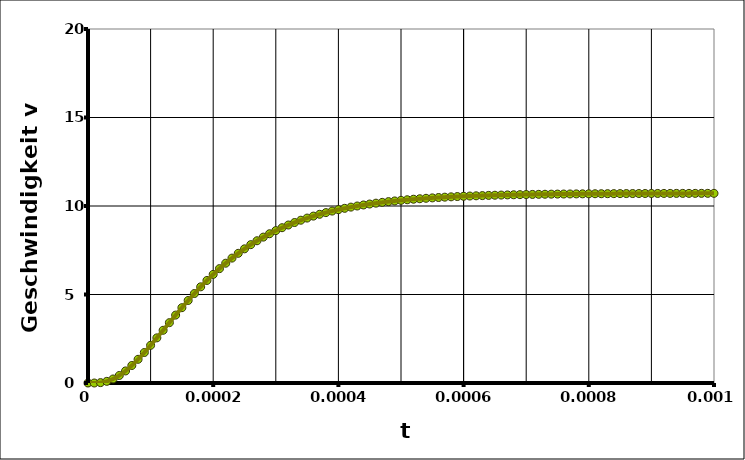
| Category | Series 0 |
|---|---|
| 0.0 | 0 |
| 1e-05 | 0 |
| 2e-05 | 0.022 |
| 3.0000000000000004e-05 | 0.093 |
| 4e-05 | 0.227 |
| 5e-05 | 0.424 |
| 6e-05 | 0.681 |
| 7.000000000000001e-05 | 0.989 |
| 8e-05 | 1.339 |
| 9e-05 | 1.722 |
| 0.0001 | 2.128 |
| 0.00011 | 2.55 |
| 0.00012 | 2.979 |
| 0.00013000000000000002 | 3.409 |
| 0.00014000000000000001 | 3.836 |
| 0.00015000000000000001 | 4.255 |
| 0.00016 | 4.662 |
| 0.00017 | 5.055 |
| 0.00018 | 5.433 |
| 0.00019 | 5.794 |
| 0.0002 | 6.137 |
| 0.00021 | 6.461 |
| 0.00022 | 6.768 |
| 0.00023 | 7.056 |
| 0.00024 | 7.326 |
| 0.00025 | 7.58 |
| 0.00026000000000000003 | 7.816 |
| 0.00027000000000000006 | 8.036 |
| 0.0002800000000000001 | 8.242 |
| 0.0002900000000000001 | 8.432 |
| 0.00030000000000000014 | 8.61 |
| 0.00031000000000000016 | 8.774 |
| 0.0003200000000000002 | 8.926 |
| 0.0003300000000000002 | 9.067 |
| 0.00034000000000000024 | 9.197 |
| 0.00035000000000000027 | 9.318 |
| 0.0003600000000000003 | 9.429 |
| 0.0003700000000000003 | 9.532 |
| 0.00038000000000000035 | 9.626 |
| 0.00039000000000000037 | 9.714 |
| 0.0004000000000000004 | 9.794 |
| 0.0004100000000000004 | 9.869 |
| 0.00042000000000000045 | 9.937 |
| 0.0004300000000000005 | 10 |
| 0.0004400000000000005 | 10.058 |
| 0.00045000000000000053 | 10.111 |
| 0.00046000000000000056 | 10.161 |
| 0.0004700000000000006 | 10.206 |
| 0.0004800000000000006 | 10.247 |
| 0.0004900000000000006 | 10.286 |
| 0.0005000000000000007 | 10.321 |
| 0.0005100000000000007 | 10.353 |
| 0.0005200000000000007 | 10.383 |
| 0.0005300000000000007 | 10.41 |
| 0.0005400000000000008 | 10.436 |
| 0.0005500000000000008 | 10.459 |
| 0.0005600000000000008 | 10.48 |
| 0.0005700000000000008 | 10.5 |
| 0.0005800000000000009 | 10.518 |
| 0.0005900000000000009 | 10.534 |
| 0.0006000000000000009 | 10.549 |
| 0.000610000000000001 | 10.563 |
| 0.000620000000000001 | 10.576 |
| 0.000630000000000001 | 10.588 |
| 0.000640000000000001 | 10.599 |
| 0.0006500000000000011 | 10.609 |
| 0.0006600000000000011 | 10.618 |
| 0.0006700000000000011 | 10.626 |
| 0.0006800000000000011 | 10.634 |
| 0.0006900000000000012 | 10.641 |
| 0.0007000000000000012 | 10.648 |
| 0.0007100000000000012 | 10.654 |
| 0.0007200000000000012 | 10.659 |
| 0.0007300000000000013 | 10.664 |
| 0.0007400000000000013 | 10.669 |
| 0.0007500000000000013 | 10.673 |
| 0.0007600000000000013 | 10.677 |
| 0.0007700000000000014 | 10.681 |
| 0.0007800000000000014 | 10.684 |
| 0.0007900000000000014 | 10.687 |
| 0.0008000000000000014 | 10.69 |
| 0.0008100000000000015 | 10.692 |
| 0.0008200000000000015 | 10.695 |
| 0.0008300000000000015 | 10.697 |
| 0.0008400000000000016 | 10.699 |
| 0.0008500000000000016 | 10.701 |
| 0.0008600000000000016 | 10.702 |
| 0.0008700000000000016 | 10.704 |
| 0.0008800000000000017 | 10.705 |
| 0.0008900000000000017 | 10.707 |
| 0.0009000000000000017 | 10.708 |
| 0.0009100000000000017 | 10.709 |
| 0.0009200000000000018 | 10.71 |
| 0.0009300000000000018 | 10.711 |
| 0.0009400000000000018 | 10.712 |
| 0.0009500000000000018 | 10.712 |
| 0.0009600000000000019 | 10.713 |
| 0.0009700000000000019 | 10.714 |
| 0.000980000000000002 | 10.714 |
| 0.000990000000000002 | 10.715 |
| 0.001000000000000002 | 10.716 |
| 0.001010000000000002 | 10.716 |
| 0.001020000000000002 | 10.716 |
| 0.001030000000000002 | 10.717 |
| 0.001040000000000002 | 10.717 |
| 0.001050000000000002 | 10.718 |
| 0.0010600000000000021 | 10.718 |
| 0.0010700000000000022 | 10.718 |
| 0.0010800000000000022 | 10.718 |
| 0.0010900000000000022 | 10.719 |
| 0.0011000000000000022 | 10.719 |
| 0.0011100000000000023 | 10.719 |
| 0.0011200000000000023 | 10.719 |
| 0.0011300000000000023 | 10.719 |
| 0.0011400000000000023 | 10.72 |
| 0.0011500000000000024 | 10.72 |
| 0.0011600000000000024 | 10.72 |
| 0.0011700000000000024 | 10.72 |
| 0.0011800000000000024 | 10.72 |
| 0.0011900000000000025 | 10.72 |
| 0.0012000000000000025 | 10.72 |
| 0.0012100000000000025 | 10.72 |
| 0.0012200000000000025 | 10.72 |
| 0.0012300000000000026 | 10.72 |
| 0.0012400000000000026 | 10.721 |
| 0.0012500000000000026 | 10.721 |
| 0.0012600000000000027 | 10.721 |
| 0.0012700000000000027 | 10.721 |
| 0.0012800000000000027 | 10.721 |
| 0.0012900000000000027 | 10.721 |
| 0.0013000000000000028 | 10.721 |
| 0.0013100000000000028 | 10.721 |
| 0.0013200000000000028 | 10.721 |
| 0.0013300000000000028 | 10.721 |
| 0.0013400000000000029 | 10.721 |
| 0.0013500000000000029 | 10.721 |
| 0.001360000000000003 | 10.721 |
| 0.001370000000000003 | 10.721 |
| 0.001380000000000003 | 10.721 |
| 0.001390000000000003 | 10.721 |
| 0.001400000000000003 | 10.721 |
| 0.001410000000000003 | 10.721 |
| 0.001420000000000003 | 10.721 |
| 0.001430000000000003 | 10.721 |
| 0.0014400000000000031 | 10.721 |
| 0.0014500000000000032 | 10.721 |
| 0.0014600000000000032 | 10.721 |
| 0.0014700000000000032 | 10.721 |
| 0.0014800000000000032 | 10.721 |
| 0.0014900000000000033 | 10.721 |
| 0.0015000000000000033 | 10.721 |
| 0.0015100000000000033 | 10.721 |
| 0.0015200000000000033 | 10.721 |
| 0.0015300000000000034 | 10.721 |
| 0.0015400000000000034 | 10.721 |
| 0.0015500000000000034 | 10.721 |
| 0.0015600000000000034 | 10.721 |
| 0.0015700000000000035 | 10.721 |
| 0.0015800000000000035 | 10.721 |
| 0.0015900000000000035 | 10.721 |
| 0.0016000000000000035 | 10.721 |
| 0.0016100000000000036 | 10.721 |
| 0.0016200000000000036 | 10.721 |
| 0.0016300000000000036 | 10.721 |
| 0.0016400000000000037 | 10.721 |
| 0.0016500000000000037 | 10.721 |
| 0.0016600000000000037 | 10.721 |
| 0.0016700000000000037 | 10.721 |
| 0.0016800000000000038 | 10.721 |
| 0.0016900000000000038 | 10.721 |
| 0.0017000000000000038 | 10.721 |
| 0.0017100000000000038 | 10.721 |
| 0.0017200000000000039 | 10.721 |
| 0.0017300000000000039 | 10.721 |
| 0.001740000000000004 | 10.721 |
| 0.001750000000000004 | 10.721 |
| 0.001760000000000004 | 10.721 |
| 0.001770000000000004 | 10.721 |
| 0.001780000000000004 | 10.721 |
| 0.001790000000000004 | 10.721 |
| 0.001800000000000004 | 10.721 |
| 0.001810000000000004 | 10.721 |
| 0.0018200000000000041 | 10.721 |
| 0.0018300000000000041 | 10.721 |
| 0.0018400000000000042 | 10.721 |
| 0.0018500000000000042 | 10.721 |
| 0.0018600000000000042 | 10.721 |
| 0.0018700000000000043 | 10.721 |
| 0.0018800000000000043 | 10.721 |
| 0.0018900000000000043 | 10.721 |
| 0.0019000000000000043 | 10.721 |
| 0.0019100000000000044 | 10.721 |
| 0.0019200000000000044 | 10.721 |
| 0.0019300000000000044 | 10.721 |
| 0.0019400000000000044 | 10.721 |
| 0.0019500000000000045 | 10.721 |
| 0.0019600000000000043 | 10.721 |
| 0.0019700000000000043 | 10.721 |
| 0.0019800000000000043 | 10.721 |
| 0.0019900000000000044 | 10.721 |
| 0.0020000000000000044 | 10.721 |
| 0.0020100000000000044 | 10.721 |
| 0.0020200000000000044 | 10.721 |
| 0.0020300000000000045 | 10.721 |
| 0.0020400000000000045 | 10.721 |
| 0.0020500000000000045 | 10.721 |
| 0.0020600000000000045 | 10.721 |
| 0.0020700000000000046 | 10.721 |
| 0.0020800000000000046 | 10.721 |
| 0.0020900000000000046 | 10.721 |
| 0.0021000000000000046 | 10.721 |
| 0.0021100000000000047 | 10.721 |
| 0.0021200000000000047 | 10.721 |
| 0.0021300000000000047 | 10.721 |
| 0.0021400000000000047 | 10.721 |
| 0.0021500000000000048 | 10.721 |
| 0.002160000000000005 | 10.721 |
| 0.002170000000000005 | 10.721 |
| 0.002180000000000005 | 10.721 |
| 0.002190000000000005 | 10.721 |
| 0.002200000000000005 | 10.721 |
| 0.002210000000000005 | 10.721 |
| 0.002220000000000005 | 10.721 |
| 0.002230000000000005 | 10.721 |
| 0.002240000000000005 | 10.721 |
| 0.002250000000000005 | 10.721 |
| 0.002260000000000005 | 10.721 |
| 0.002270000000000005 | 10.721 |
| 0.002280000000000005 | 10.721 |
| 0.002290000000000005 | 10.721 |
| 0.002300000000000005 | 10.721 |
| 0.002310000000000005 | 10.721 |
| 0.0023200000000000052 | 10.721 |
| 0.0023300000000000052 | 10.721 |
| 0.0023400000000000053 | 10.721 |
| 0.0023500000000000053 | 10.721 |
| 0.0023600000000000053 | 10.721 |
| 0.0023700000000000053 | 10.721 |
| 0.0023800000000000054 | 10.721 |
| 0.0023900000000000054 | 10.721 |
| 0.0024000000000000054 | 10.721 |
| 0.0024100000000000055 | 10.721 |
| 0.0024200000000000055 | 10.721 |
| 0.0024300000000000055 | 10.721 |
| 0.0024400000000000055 | 10.721 |
| 0.0024500000000000056 | 10.721 |
| 0.0024600000000000056 | 10.721 |
| 0.0024700000000000056 | 10.721 |
| 0.0024800000000000056 | 10.721 |
| 0.0024900000000000057 | 10.721 |
| 0.0025000000000000057 | 10.721 |
| 0.0025100000000000057 | 10.721 |
| 0.0025200000000000057 | 10.721 |
| 0.0025300000000000058 | 10.721 |
| 0.002540000000000006 | 10.721 |
| 0.002550000000000006 | 10.721 |
| 0.002560000000000006 | 10.721 |
| 0.002570000000000006 | 10.721 |
| 0.002580000000000006 | 10.721 |
| 0.002590000000000006 | 10.721 |
| 0.002600000000000006 | 10.721 |
| 0.002610000000000006 | 10.721 |
| 0.002620000000000006 | 10.721 |
| 0.002630000000000006 | 10.721 |
| 0.002640000000000006 | 10.721 |
| 0.002650000000000006 | 10.721 |
| 0.002660000000000006 | 10.721 |
| 0.002670000000000006 | 10.721 |
| 0.002680000000000006 | 10.721 |
| 0.002690000000000006 | 10.721 |
| 0.002700000000000006 | 10.721 |
| 0.0027100000000000062 | 10.721 |
| 0.0027200000000000063 | 10.721 |
| 0.0027300000000000063 | 10.721 |
| 0.0027400000000000063 | 10.721 |
| 0.0027500000000000063 | 10.721 |
| 0.0027600000000000064 | 10.721 |
| 0.0027700000000000064 | 10.721 |
| 0.0027800000000000064 | 10.721 |
| 0.0027900000000000065 | 10.721 |
| 0.0028000000000000065 | 10.721 |
| 0.0028100000000000065 | 10.721 |
| 0.0028200000000000065 | 10.721 |
| 0.0028300000000000066 | 10.721 |
| 0.0028400000000000066 | 10.721 |
| 0.0028500000000000066 | 10.721 |
| 0.0028600000000000066 | 10.721 |
| 0.0028700000000000067 | 10.721 |
| 0.0028800000000000067 | 10.721 |
| 0.0028900000000000067 | 10.721 |
| 0.0029000000000000067 | 10.721 |
| 0.0029100000000000068 | 10.721 |
| 0.002920000000000007 | 10.721 |
| 0.002930000000000007 | 10.721 |
| 0.002940000000000007 | 10.721 |
| 0.002950000000000007 | 10.721 |
| 0.002960000000000007 | 10.721 |
| 0.002970000000000007 | 10.721 |
| 0.002980000000000007 | 10.721 |
| 0.002990000000000007 | 10.721 |
| 0.003000000000000007 | 10.721 |
| 0.003010000000000007 | 10.721 |
| 0.003020000000000007 | 10.721 |
| 0.003030000000000007 | 10.721 |
| 0.003040000000000007 | 10.721 |
| 0.003050000000000007 | 10.721 |
| 0.003060000000000007 | 10.721 |
| 0.003070000000000007 | 10.721 |
| 0.003080000000000007 | 10.721 |
| 0.0030900000000000072 | 10.721 |
| 0.0031000000000000073 | 10.721 |
| 0.0031100000000000073 | 10.721 |
| 0.0031200000000000073 | 10.721 |
| 0.0031300000000000073 | 10.721 |
| 0.0031400000000000074 | 10.721 |
| 0.0031500000000000074 | 10.721 |
| 0.0031600000000000074 | 10.721 |
| 0.0031700000000000074 | 10.721 |
| 0.0031800000000000075 | 10.721 |
| 0.0031900000000000075 | 10.721 |
| 0.0032000000000000075 | 10.721 |
| 0.0032100000000000076 | 10.721 |
| 0.0032200000000000076 | 10.721 |
| 0.0032300000000000076 | 10.721 |
| 0.0032400000000000076 | 10.721 |
| 0.0032500000000000077 | 10.721 |
| 0.0032600000000000077 | 10.721 |
| 0.0032700000000000077 | 10.721 |
| 0.0032800000000000077 | 10.721 |
| 0.0032900000000000078 | 10.721 |
| 0.003300000000000008 | 10.721 |
| 0.003310000000000008 | 10.721 |
| 0.003320000000000008 | 10.721 |
| 0.003330000000000008 | 10.721 |
| 0.003340000000000008 | 10.721 |
| 0.003350000000000008 | 10.721 |
| 0.003360000000000008 | 10.721 |
| 0.003370000000000008 | 10.721 |
| 0.003380000000000008 | 10.721 |
| 0.003390000000000008 | 10.721 |
| 0.003400000000000008 | 10.721 |
| 0.003410000000000008 | 10.721 |
| 0.003420000000000008 | 10.721 |
| 0.003430000000000008 | 10.721 |
| 0.003440000000000008 | 10.721 |
| 0.003450000000000008 | 10.721 |
| 0.003460000000000008 | 10.721 |
| 0.0034700000000000082 | 10.721 |
| 0.0034800000000000083 | 10.721 |
| 0.0034900000000000083 | 10.721 |
| 0.0035000000000000083 | 10.721 |
| 0.0035100000000000083 | 10.721 |
| 0.0035200000000000084 | 10.721 |
| 0.0035300000000000084 | 10.721 |
| 0.0035400000000000084 | 10.721 |
| 0.0035500000000000084 | 10.721 |
| 0.0035600000000000085 | 10.721 |
| 0.0035700000000000085 | 10.721 |
| 0.0035800000000000085 | 10.721 |
| 0.0035900000000000085 | 10.721 |
| 0.0036000000000000086 | 10.721 |
| 0.0036100000000000086 | 10.721 |
| 0.0036200000000000086 | 10.721 |
| 0.0036300000000000087 | 10.721 |
| 0.0036400000000000087 | 10.721 |
| 0.0036500000000000087 | 10.721 |
| 0.0036600000000000087 | 10.721 |
| 0.0036700000000000088 | 10.721 |
| 0.003680000000000009 | 10.721 |
| 0.003690000000000009 | 10.721 |
| 0.003700000000000009 | 10.721 |
| 0.003710000000000009 | 10.721 |
| 0.003720000000000009 | 10.721 |
| 0.003730000000000009 | 10.721 |
| 0.003740000000000009 | 10.721 |
| 0.003750000000000009 | 10.721 |
| 0.003760000000000009 | 10.721 |
| 0.003770000000000009 | 10.721 |
| 0.003780000000000009 | 10.721 |
| 0.003790000000000009 | 10.721 |
| 0.003800000000000009 | 10.721 |
| 0.003810000000000009 | 10.721 |
| 0.003820000000000009 | 10.721 |
| 0.003830000000000009 | 10.721 |
| 0.003840000000000009 | 10.721 |
| 0.0038500000000000092 | 10.721 |
| 0.0038600000000000093 | 10.721 |
| 0.0038700000000000093 | 10.721 |
| 0.0038800000000000093 | 10.721 |
| 0.0038900000000000093 | 10.721 |
| 0.0039000000000000094 | 10.721 |
| 0.003910000000000009 | 10.721 |
| 0.0039200000000000085 | 10.721 |
| 0.003930000000000008 | 10.721 |
| 0.003940000000000008 | 10.721 |
| 0.003950000000000007 | 10.721 |
| 0.003960000000000007 | 10.721 |
| 0.0039700000000000065 | 10.721 |
| 0.003980000000000006 | 10.721 |
| 0.003990000000000006 | 10.721 |
| 0.004000000000000005 | 10.721 |
| 0.004010000000000005 | 10.721 |
| 0.0040200000000000045 | 10.721 |
| 0.004030000000000004 | 10.721 |
| 0.004040000000000004 | 10.721 |
| 0.004050000000000003 | 10.721 |
| 0.004060000000000003 | 10.721 |
| 0.0040700000000000024 | 10.721 |
| 0.004080000000000002 | 10.721 |
| 0.004090000000000002 | 10.721 |
| 0.004100000000000001 | 10.721 |
| 0.004110000000000001 | 10.721 |
| 0.00412 | 10.721 |
| 0.00413 | 10.721 |
| 0.00414 | 10.721 |
| 0.004149999999999999 | 10.721 |
| 0.004159999999999999 | 10.721 |
| 0.004169999999999998 | 10.721 |
| 0.004179999999999998 | 10.721 |
| 0.0041899999999999975 | 10.721 |
| 0.004199999999999997 | 10.721 |
| 0.004209999999999997 | 10.721 |
| 0.004219999999999996 | 10.721 |
| 0.004229999999999996 | 10.721 |
| 0.0042399999999999955 | 10.721 |
| 0.004249999999999995 | 10.721 |
| 0.004259999999999995 | 10.721 |
| 0.004269999999999994 | 10.721 |
| 0.004279999999999994 | 10.721 |
| 0.0042899999999999935 | 10.721 |
| 0.004299999999999993 | 10.721 |
| 0.004309999999999993 | 10.721 |
| 0.004319999999999992 | 10.721 |
| 0.004329999999999992 | 10.721 |
| 0.0043399999999999914 | 10.721 |
| 0.004349999999999991 | 10.721 |
| 0.004359999999999991 | 10.721 |
| 0.00436999999999999 | 10.721 |
| 0.00437999999999999 | 10.721 |
| 0.004389999999999989 | 10.721 |
| 0.004399999999999989 | 10.721 |
| 0.004409999999999989 | 10.721 |
| 0.004419999999999988 | 10.721 |
| 0.004429999999999988 | 10.721 |
| 0.004439999999999987 | 10.721 |
| 0.004449999999999987 | 10.721 |
| 0.0044599999999999865 | 10.721 |
| 0.004469999999999986 | 10.721 |
| 0.004479999999999986 | 10.721 |
| 0.004489999999999985 | 10.721 |
| 0.004499999999999985 | 10.721 |
| 0.0045099999999999845 | 10.721 |
| 0.004519999999999984 | 10.721 |
| 0.004529999999999984 | 10.721 |
| 0.004539999999999983 | 10.721 |
| 0.004549999999999983 | 10.721 |
| 0.0045599999999999825 | 10.721 |
| 0.004569999999999982 | 10.721 |
| 0.004579999999999982 | 10.721 |
| 0.004589999999999981 | 10.721 |
| 0.004599999999999981 | 10.721 |
| 0.00460999999999998 | 10.721 |
| 0.00461999999999998 | 10.721 |
| 0.00462999999999998 | 10.721 |
| 0.004639999999999979 | 10.721 |
| 0.004649999999999979 | 10.721 |
| 0.004659999999999978 | 10.721 |
| 0.004669999999999978 | 10.721 |
| 0.004679999999999978 | 10.721 |
| 0.004689999999999977 | 10.721 |
| 0.004699999999999977 | 10.721 |
| 0.004709999999999976 | 10.721 |
| 0.004719999999999976 | 10.721 |
| 0.0047299999999999755 | 10.721 |
| 0.004739999999999975 | 10.721 |
| 0.004749999999999975 | 10.721 |
| 0.004759999999999974 | 10.721 |
| 0.004769999999999974 | 10.721 |
| 0.0047799999999999735 | 10.721 |
| 0.004789999999999973 | 10.721 |
| 0.004799999999999973 | 10.721 |
| 0.004809999999999972 | 10.721 |
| 0.004819999999999972 | 10.721 |
| 0.0048299999999999715 | 10.721 |
| 0.004839999999999971 | 10.721 |
| 0.004849999999999971 | 10.721 |
| 0.00485999999999997 | 10.721 |
| 0.00486999999999997 | 10.721 |
| 0.004879999999999969 | 10.721 |
| 0.004889999999999969 | 10.721 |
| 0.004899999999999969 | 10.721 |
| 0.004909999999999968 | 10.721 |
| 0.004919999999999968 | 10.721 |
| 0.004929999999999967 | 10.721 |
| 0.004939999999999967 | 10.721 |
| 0.004949999999999967 | 10.721 |
| 0.004959999999999966 | 10.721 |
| 0.004969999999999966 | 10.721 |
| 0.004979999999999965 | 10.721 |
| 0.004989999999999965 | 10.721 |
| 0.0049999999999999645 | 10.721 |
| 0.005009999999999964 | 10.721 |
| 0.005019999999999964 | 10.721 |
| 0.005029999999999963 | 10.721 |
| 0.005039999999999963 | 10.721 |
| 0.0050499999999999625 | 10.721 |
| 0.005059999999999962 | 10.721 |
| 0.005069999999999962 | 10.721 |
| 0.005079999999999961 | 10.721 |
| 0.005089999999999961 | 10.721 |
| 0.0050999999999999605 | 10.721 |
| 0.00510999999999996 | 10.721 |
| 0.00511999999999996 | 10.721 |
| 0.005129999999999959 | 10.721 |
| 0.005139999999999959 | 10.721 |
| 0.005149999999999958 | 10.721 |
| 0.005159999999999958 | 10.721 |
| 0.005169999999999958 | 10.721 |
| 0.005179999999999957 | 10.721 |
| 0.005189999999999957 | 10.721 |
| 0.005199999999999956 | 10.721 |
| 0.005209999999999956 | 10.721 |
| 0.005219999999999956 | 10.721 |
| 0.005229999999999955 | 10.721 |
| 0.005239999999999955 | 10.721 |
| 0.005249999999999954 | 10.721 |
| 0.005259999999999954 | 10.721 |
| 0.0052699999999999535 | 10.721 |
| 0.005279999999999953 | 10.721 |
| 0.005289999999999953 | 10.721 |
| 0.005299999999999952 | 10.721 |
| 0.005309999999999952 | 10.721 |
| 0.0053199999999999515 | 10.721 |
| 0.005329999999999951 | 10.721 |
| 0.005339999999999951 | 10.721 |
| 0.00534999999999995 | 10.721 |
| 0.00535999999999995 | 10.721 |
| 0.0053699999999999495 | 10.721 |
| 0.005379999999999949 | 10.721 |
| 0.005389999999999949 | 10.721 |
| 0.005399999999999948 | 10.721 |
| 0.005409999999999948 | 10.721 |
| 0.005419999999999947 | 10.721 |
| 0.005429999999999947 | 10.721 |
| 0.005439999999999947 | 10.721 |
| 0.005449999999999946 | 10.721 |
| 0.005459999999999946 | 10.721 |
| 0.005469999999999945 | 10.721 |
| 0.005479999999999945 | 10.721 |
| 0.005489999999999945 | 10.721 |
| 0.005499999999999944 | 10.721 |
| 0.005509999999999944 | 10.721 |
| 0.005519999999999943 | 10.721 |
| 0.005529999999999943 | 10.721 |
| 0.0055399999999999425 | 10.721 |
| 0.005549999999999942 | 10.721 |
| 0.005559999999999942 | 10.721 |
| 0.005569999999999941 | 10.721 |
| 0.005579999999999941 | 10.721 |
| 0.0055899999999999405 | 10.721 |
| 0.00559999999999994 | 10.721 |
| 0.00560999999999994 | 10.721 |
| 0.005619999999999939 | 10.721 |
| 0.005629999999999939 | 10.721 |
| 0.0056399999999999385 | 10.721 |
| 0.005649999999999938 | 10.721 |
| 0.005659999999999938 | 10.721 |
| 0.005669999999999937 | 10.721 |
| 0.005679999999999937 | 10.721 |
| 0.005689999999999936 | 10.721 |
| 0.005699999999999936 | 10.721 |
| 0.005709999999999936 | 10.721 |
| 0.005719999999999935 | 10.721 |
| 0.005729999999999935 | 10.721 |
| 0.005739999999999934 | 10.721 |
| 0.005749999999999934 | 10.721 |
| 0.005759999999999934 | 10.721 |
| 0.005769999999999933 | 10.721 |
| 0.005779999999999933 | 10.721 |
| 0.005789999999999932 | 10.721 |
| 0.005799999999999932 | 10.721 |
| 0.0058099999999999315 | 10.721 |
| 0.005819999999999931 | 10.721 |
| 0.005829999999999931 | 10.721 |
| 0.00583999999999993 | 10.721 |
| 0.00584999999999993 | 10.721 |
| 0.0058599999999999295 | 10.721 |
| 0.005869999999999929 | 10.721 |
| 0.005879999999999929 | 10.721 |
| 0.005889999999999928 | 10.721 |
| 0.005899999999999928 | 10.721 |
| 0.0059099999999999275 | 10.721 |
| 0.005919999999999927 | 10.721 |
| 0.005929999999999927 | 10.721 |
| 0.005939999999999926 | 10.721 |
| 0.005949999999999926 | 10.721 |
| 0.005959999999999925 | 10.721 |
| 0.005969999999999925 | 10.721 |
| 0.005979999999999925 | 10.721 |
| 0.005989999999999924 | 10.721 |
| 0.005999999999999924 | 10.721 |
| 0.006009999999999923 | 10.721 |
| 0.006019999999999923 | 10.721 |
| 0.006029999999999923 | 10.721 |
| 0.006039999999999922 | 10.721 |
| 0.006049999999999922 | 10.721 |
| 0.006059999999999921 | 10.721 |
| 0.006069999999999921 | 10.721 |
| 0.0060799999999999205 | 10.721 |
| 0.00608999999999992 | 10.721 |
| 0.00609999999999992 | 10.721 |
| 0.006109999999999919 | 10.721 |
| 0.006119999999999919 | 10.721 |
| 0.0061299999999999185 | 10.721 |
| 0.006139999999999918 | 10.721 |
| 0.006149999999999918 | 10.721 |
| 0.006159999999999917 | 10.721 |
| 0.006169999999999917 | 10.721 |
| 0.0061799999999999165 | 10.721 |
| 0.006189999999999916 | 10.721 |
| 0.006199999999999916 | 10.721 |
| 0.006209999999999915 | 10.721 |
| 0.006219999999999915 | 10.721 |
| 0.006229999999999914 | 10.721 |
| 0.006239999999999914 | 10.721 |
| 0.006249999999999914 | 10.721 |
| 0.006259999999999913 | 10.721 |
| 0.006269999999999913 | 10.721 |
| 0.006279999999999912 | 10.721 |
| 0.006289999999999912 | 10.721 |
| 0.006299999999999912 | 10.721 |
| 0.006309999999999911 | 10.721 |
| 0.006319999999999911 | 10.721 |
| 0.00632999999999991 | 10.721 |
| 0.00633999999999991 | 10.721 |
| 0.0063499999999999095 | 10.721 |
| 0.006359999999999909 | 10.721 |
| 0.006369999999999909 | 10.721 |
| 0.006379999999999908 | 10.721 |
| 0.006389999999999908 | 10.721 |
| 0.0063999999999999075 | 10.721 |
| 0.006409999999999907 | 10.721 |
| 0.006419999999999907 | 10.721 |
| 0.006429999999999906 | 10.721 |
| 0.006439999999999906 | 10.721 |
| 0.0064499999999999055 | 10.721 |
| 0.006459999999999905 | 10.721 |
| 0.006469999999999905 | 10.721 |
| 0.006479999999999904 | 10.721 |
| 0.006489999999999904 | 10.721 |
| 0.006499999999999903 | 10.721 |
| 0.006509999999999903 | 10.721 |
| 0.006519999999999903 | 10.721 |
| 0.006529999999999902 | 10.721 |
| 0.006539999999999902 | 10.721 |
| 0.006549999999999901 | 10.721 |
| 0.006559999999999901 | 10.721 |
| 0.006569999999999901 | 10.721 |
| 0.0065799999999999 | 10.721 |
| 0.0065899999999999 | 10.721 |
| 0.006599999999999899 | 10.721 |
| 0.006609999999999899 | 10.721 |
| 0.0066199999999998985 | 10.721 |
| 0.006629999999999898 | 10.721 |
| 0.006639999999999898 | 10.721 |
| 0.006649999999999897 | 10.721 |
| 0.006659999999999897 | 10.721 |
| 0.0066699999999998965 | 10.721 |
| 0.006679999999999896 | 10.721 |
| 0.006689999999999896 | 10.721 |
| 0.006699999999999895 | 10.721 |
| 0.006709999999999895 | 10.721 |
| 0.0067199999999998945 | 10.721 |
| 0.006729999999999894 | 10.721 |
| 0.006739999999999894 | 10.721 |
| 0.006749999999999893 | 10.721 |
| 0.006759999999999893 | 10.721 |
| 0.006769999999999892 | 10.721 |
| 0.006779999999999892 | 10.721 |
| 0.006789999999999892 | 10.721 |
| 0.006799999999999891 | 10.721 |
| 0.006809999999999891 | 10.721 |
| 0.00681999999999989 | 10.721 |
| 0.00682999999999989 | 10.721 |
| 0.00683999999999989 | 10.721 |
| 0.006849999999999889 | 10.721 |
| 0.006859999999999889 | 10.721 |
| 0.006869999999999888 | 10.721 |
| 0.006879999999999888 | 10.721 |
| 0.0068899999999998875 | 10.721 |
| 0.006899999999999887 | 10.721 |
| 0.006909999999999887 | 10.721 |
| 0.006919999999999886 | 10.721 |
| 0.006929999999999886 | 10.721 |
| 0.0069399999999998855 | 10.721 |
| 0.006949999999999885 | 10.721 |
| 0.006959999999999885 | 10.721 |
| 0.006969999999999884 | 10.721 |
| 0.006979999999999884 | 10.721 |
| 0.0069899999999998835 | 10.721 |
| 0.006999999999999883 | 10.721 |
| 0.007009999999999883 | 10.721 |
| 0.007019999999999882 | 10.721 |
| 0.007029999999999882 | 10.721 |
| 0.007039999999999881 | 10.721 |
| 0.007049999999999881 | 10.721 |
| 0.007059999999999881 | 10.721 |
| 0.00706999999999988 | 10.721 |
| 0.00707999999999988 | 10.721 |
| 0.007089999999999879 | 10.721 |
| 0.007099999999999879 | 10.721 |
| 0.007109999999999879 | 10.721 |
| 0.007119999999999878 | 10.721 |
| 0.007129999999999878 | 10.721 |
| 0.007139999999999877 | 10.721 |
| 0.007149999999999877 | 10.721 |
| 0.0071599999999998765 | 10.721 |
| 0.007169999999999876 | 10.721 |
| 0.007179999999999876 | 10.721 |
| 0.007189999999999875 | 10.721 |
| 0.007199999999999875 | 10.721 |
| 0.0072099999999998745 | 10.721 |
| 0.007219999999999874 | 10.721 |
| 0.007229999999999874 | 10.721 |
| 0.007239999999999873 | 10.721 |
| 0.007249999999999873 | 10.721 |
| 0.0072599999999998725 | 10.721 |
| 0.007269999999999872 | 10.721 |
| 0.007279999999999872 | 10.721 |
| 0.007289999999999871 | 10.721 |
| 0.007299999999999871 | 10.721 |
| 0.00730999999999987 | 10.721 |
| 0.00731999999999987 | 10.721 |
| 0.00732999999999987 | 10.721 |
| 0.007339999999999869 | 10.721 |
| 0.007349999999999869 | 10.721 |
| 0.007359999999999868 | 10.721 |
| 0.007369999999999868 | 10.721 |
| 0.007379999999999868 | 10.721 |
| 0.007389999999999867 | 10.721 |
| 0.007399999999999867 | 10.721 |
| 0.007409999999999866 | 10.721 |
| 0.007419999999999866 | 10.721 |
| 0.0074299999999998655 | 10.721 |
| 0.007439999999999865 | 10.721 |
| 0.007449999999999865 | 10.721 |
| 0.007459999999999864 | 10.721 |
| 0.007469999999999864 | 10.721 |
| 0.0074799999999998635 | 10.721 |
| 0.007489999999999863 | 10.721 |
| 0.007499999999999863 | 10.721 |
| 0.007509999999999862 | 10.721 |
| 0.007519999999999862 | 10.721 |
| 0.0075299999999998615 | 10.721 |
| 0.007539999999999861 | 10.721 |
| 0.007549999999999861 | 10.721 |
| 0.00755999999999986 | 10.721 |
| 0.00756999999999986 | 10.721 |
| 0.007579999999999859 | 10.721 |
| 0.007589999999999859 | 10.721 |
| 0.007599999999999859 | 10.721 |
| 0.007609999999999858 | 10.721 |
| 0.007619999999999858 | 10.721 |
| 0.007629999999999857 | 10.721 |
| 0.007639999999999857 | 10.721 |
| 0.007649999999999857 | 10.721 |
| 0.007659999999999856 | 10.721 |
| 0.007669999999999856 | 10.721 |
| 0.007679999999999855 | 10.721 |
| 0.007689999999999855 | 10.721 |
| 0.0076999999999998545 | 10.721 |
| 0.007709999999999854 | 10.721 |
| 0.007719999999999854 | 10.721 |
| 0.007729999999999853 | 10.721 |
| 0.007739999999999853 | 10.721 |
| 0.0077499999999998525 | 10.721 |
| 0.007759999999999852 | 10.721 |
| 0.007769999999999852 | 10.721 |
| 0.007779999999999851 | 10.721 |
| 0.007789999999999851 | 10.721 |
| 0.0077999999999998505 | 10.721 |
| 0.00780999999999985 | 10.721 |
| 0.00781999999999985 | 10.721 |
| 0.00782999999999985 | 10.721 |
| 0.007839999999999849 | 10.721 |
| 0.007849999999999848 | 10.721 |
| 0.007859999999999848 | 10.721 |
| 0.007869999999999848 | 10.721 |
| 0.007879999999999847 | 10.721 |
| 0.007889999999999847 | 10.721 |
| 0.007899999999999846 | 10.721 |
| 0.007909999999999846 | 10.721 |
| 0.007919999999999846 | 10.721 |
| 0.007929999999999845 | 10.721 |
| 0.007939999999999845 | 10.721 |
| 0.007949999999999844 | 10.721 |
| 0.007959999999999844 | 10.721 |
| 0.007969999999999844 | 10.721 |
| 0.007979999999999843 | 10.721 |
| 0.007989999999999843 | 10.721 |
| 0.007999999999999842 | 10.721 |
| 0.008009999999999842 | 10.721 |
| 0.008019999999999841 | 10.721 |
| 0.008029999999999841 | 10.721 |
| 0.00803999999999984 | 10.721 |
| 0.00804999999999984 | 10.721 |
| 0.00805999999999984 | 10.721 |
| 0.00806999999999984 | 10.721 |
| 0.008079999999999839 | 10.721 |
| 0.008089999999999839 | 10.721 |
| 0.008099999999999838 | 10.721 |
| 0.008109999999999838 | 10.721 |
| 0.008119999999999837 | 10.721 |
| 0.008129999999999837 | 10.721 |
| 0.008139999999999837 | 10.721 |
| 0.008149999999999836 | 10.721 |
| 0.008159999999999836 | 10.721 |
| 0.008169999999999835 | 10.721 |
| 0.008179999999999835 | 10.721 |
| 0.008189999999999835 | 10.721 |
| 0.008199999999999834 | 10.721 |
| 0.008209999999999834 | 10.721 |
| 0.008219999999999833 | 10.721 |
| 0.008229999999999833 | 10.721 |
| 0.008239999999999833 | 10.721 |
| 0.008249999999999832 | 10.721 |
| 0.008259999999999832 | 10.721 |
| 0.008269999999999831 | 10.721 |
| 0.008279999999999831 | 10.721 |
| 0.00828999999999983 | 10.721 |
| 0.00829999999999983 | 10.721 |
| 0.00830999999999983 | 10.721 |
| 0.00831999999999983 | 10.721 |
| 0.008329999999999829 | 10.721 |
| 0.008339999999999828 | 10.721 |
| 0.008349999999999828 | 10.721 |
| 0.008359999999999828 | 10.721 |
| 0.008369999999999827 | 10.721 |
| 0.008379999999999827 | 10.721 |
| 0.008389999999999826 | 10.721 |
| 0.008399999999999826 | 10.721 |
| 0.008409999999999826 | 10.721 |
| 0.008419999999999825 | 10.721 |
| 0.008429999999999825 | 10.721 |
| 0.008439999999999824 | 10.721 |
| 0.008449999999999824 | 10.721 |
| 0.008459999999999824 | 10.721 |
| 0.008469999999999823 | 10.721 |
| 0.008479999999999823 | 10.721 |
| 0.008489999999999822 | 10.721 |
| 0.008499999999999822 | 10.721 |
| 0.008509999999999822 | 10.721 |
| 0.008519999999999821 | 10.721 |
| 0.00852999999999982 | 10.721 |
| 0.00853999999999982 | 10.721 |
| 0.00854999999999982 | 10.721 |
| 0.00855999999999982 | 10.721 |
| 0.008569999999999819 | 10.721 |
| 0.008579999999999819 | 10.721 |
| 0.008589999999999818 | 10.721 |
| 0.008599999999999818 | 10.721 |
| 0.008609999999999817 | 10.721 |
| 0.008619999999999817 | 10.721 |
| 0.008629999999999817 | 10.721 |
| 0.008639999999999816 | 10.721 |
| 0.008649999999999816 | 10.721 |
| 0.008659999999999815 | 10.721 |
| 0.008669999999999815 | 10.721 |
| 0.008679999999999815 | 10.721 |
| 0.008689999999999814 | 10.721 |
| 0.008699999999999814 | 10.721 |
| 0.008709999999999813 | 10.721 |
| 0.008719999999999813 | 10.721 |
| 0.008729999999999813 | 10.721 |
| 0.008739999999999812 | 10.721 |
| 0.008749999999999812 | 10.721 |
| 0.008759999999999811 | 10.721 |
| 0.008769999999999811 | 10.721 |
| 0.00877999999999981 | 10.721 |
| 0.00878999999999981 | 10.721 |
| 0.00879999999999981 | 10.721 |
| 0.00880999999999981 | 10.721 |
| 0.008819999999999809 | 10.721 |
| 0.008829999999999808 | 10.721 |
| 0.008839999999999808 | 10.721 |
| 0.008849999999999808 | 10.721 |
| 0.008859999999999807 | 10.721 |
| 0.008869999999999807 | 10.721 |
| 0.008879999999999806 | 10.721 |
| 0.008889999999999806 | 10.721 |
| 0.008899999999999806 | 10.721 |
| 0.008909999999999805 | 10.721 |
| 0.008919999999999805 | 10.721 |
| 0.008929999999999804 | 10.721 |
| 0.008939999999999804 | 10.721 |
| 0.008949999999999804 | 10.721 |
| 0.008959999999999803 | 10.721 |
| 0.008969999999999803 | 10.721 |
| 0.008979999999999802 | 10.721 |
| 0.008989999999999802 | 10.721 |
| 0.008999999999999802 | 10.721 |
| 0.009009999999999801 | 10.721 |
| 0.0090199999999998 | 10.721 |
| 0.0090299999999998 | 10.721 |
| 0.0090399999999998 | 10.721 |
| 0.0090499999999998 | 10.721 |
| 0.009059999999999799 | 10.721 |
| 0.009069999999999799 | 10.721 |
| 0.009079999999999798 | 10.721 |
| 0.009089999999999798 | 10.721 |
| 0.009099999999999797 | 10.721 |
| 0.009109999999999797 | 10.721 |
| 0.009119999999999797 | 10.721 |
| 0.009129999999999796 | 10.721 |
| 0.009139999999999796 | 10.721 |
| 0.009149999999999795 | 10.721 |
| 0.009159999999999795 | 10.721 |
| 0.009169999999999795 | 10.721 |
| 0.009179999999999794 | 10.721 |
| 0.009189999999999794 | 10.721 |
| 0.009199999999999793 | 10.721 |
| 0.009209999999999793 | 10.721 |
| 0.009219999999999793 | 10.721 |
| 0.009229999999999792 | 10.721 |
| 0.009239999999999792 | 10.721 |
| 0.009249999999999791 | 10.721 |
| 0.009259999999999791 | 10.721 |
| 0.00926999999999979 | 10.721 |
| 0.00927999999999979 | 10.721 |
| 0.00928999999999979 | 10.721 |
| 0.00929999999999979 | 10.721 |
| 0.009309999999999789 | 10.721 |
| 0.009319999999999789 | 10.721 |
| 0.009329999999999788 | 10.721 |
| 0.009339999999999788 | 10.721 |
| 0.009349999999999787 | 10.721 |
| 0.009359999999999787 | 10.721 |
| 0.009369999999999786 | 10.721 |
| 0.009379999999999786 | 10.721 |
| 0.009389999999999786 | 10.721 |
| 0.009399999999999785 | 10.721 |
| 0.009409999999999785 | 10.721 |
| 0.009419999999999784 | 10.721 |
| 0.009429999999999784 | 10.721 |
| 0.009439999999999784 | 10.721 |
| 0.009449999999999783 | 10.721 |
| 0.009459999999999783 | 10.721 |
| 0.009469999999999782 | 10.721 |
| 0.009479999999999782 | 10.721 |
| 0.009489999999999782 | 10.721 |
| 0.009499999999999781 | 10.721 |
| 0.00950999999999978 | 10.721 |
| 0.00951999999999978 | 10.721 |
| 0.00952999999999978 | 10.721 |
| 0.00953999999999978 | 10.721 |
| 0.00954999999999978 | 10.721 |
| 0.009559999999999779 | 10.721 |
| 0.009569999999999778 | 10.721 |
| 0.009579999999999778 | 10.721 |
| 0.009589999999999778 | 10.721 |
| 0.009599999999999777 | 10.721 |
| 0.009609999999999777 | 10.721 |
| 0.009619999999999776 | 10.721 |
| 0.009629999999999776 | 10.721 |
| 0.009639999999999775 | 10.721 |
| 0.009649999999999775 | 10.721 |
| 0.009659999999999775 | 10.721 |
| 0.009669999999999774 | 10.721 |
| 0.009679999999999774 | 10.721 |
| 0.009689999999999773 | 10.721 |
| 0.009699999999999773 | 10.721 |
| 0.009709999999999773 | 10.721 |
| 0.009719999999999772 | 10.721 |
| 0.009729999999999772 | 10.721 |
| 0.009739999999999771 | 10.721 |
| 0.009749999999999771 | 10.721 |
| 0.00975999999999977 | 10.721 |
| 0.00976999999999977 | 10.721 |
| 0.00977999999999977 | 10.721 |
| 0.00978999999999977 | 10.721 |
| 0.009799999999999769 | 10.721 |
| 0.009809999999999769 | 10.721 |
| 0.009819999999999768 | 10.721 |
| 0.009829999999999768 | 10.721 |
| 0.009839999999999767 | 10.721 |
| 0.009849999999999767 | 10.721 |
| 0.009859999999999767 | 10.721 |
| 0.009869999999999766 | 10.721 |
| 0.009879999999999766 | 10.721 |
| 0.009889999999999765 | 10.721 |
| 0.009899999999999765 | 10.721 |
| 0.009909999999999764 | 10.721 |
| 0.009919999999999764 | 10.721 |
| 0.009929999999999764 | 10.721 |
| 0.009939999999999763 | 10.721 |
| 0.009949999999999763 | 10.721 |
| 0.009959999999999762 | 10.721 |
| 0.009969999999999762 | 10.721 |
| 0.009979999999999762 | 10.721 |
| 0.009989999999999761 | 10.721 |
| 0.00999999999999976 | 10.721 |
| 0.01000999999999976 | 10.721 |
| 0.01001999999999976 | 10.721 |
| 0.01002999999999976 | 10.721 |
| 0.01003999999999976 | 10.721 |
| 0.010049999999999759 | 10.721 |
| 0.010059999999999758 | 10.721 |
| 0.010069999999999758 | 10.721 |
| 0.010079999999999758 | 10.721 |
| 0.010089999999999757 | 10.721 |
| 0.010099999999999757 | 10.721 |
| 0.010109999999999756 | 10.721 |
| 0.010119999999999756 | 10.721 |
| 0.010129999999999756 | 10.721 |
| 0.010139999999999755 | 10.721 |
| 0.010149999999999755 | 10.721 |
| 0.010159999999999754 | 10.721 |
| 0.010169999999999754 | 10.721 |
| 0.010179999999999753 | 10.721 |
| 0.010189999999999753 | 10.721 |
| 0.010199999999999753 | 10.721 |
| 0.010209999999999752 | 10.721 |
| 0.010219999999999752 | 10.721 |
| 0.010229999999999751 | 10.721 |
| 0.010239999999999751 | 10.721 |
| 0.01024999999999975 | 10.721 |
| 0.01025999999999975 | 10.721 |
| 0.01026999999999975 | 10.721 |
| 0.01027999999999975 | 10.721 |
| 0.010289999999999749 | 10.721 |
| 0.010299999999999749 | 10.721 |
| 0.010309999999999748 | 10.721 |
| 0.010319999999999748 | 10.721 |
| 0.010329999999999747 | 10.721 |
| 0.010339999999999747 | 10.721 |
| 0.010349999999999747 | 10.721 |
| 0.010359999999999746 | 10.721 |
| 0.010369999999999746 | 10.721 |
| 0.010379999999999745 | 10.721 |
| 0.010389999999999745 | 10.721 |
| 0.010399999999999745 | 10.721 |
| 0.010409999999999744 | 10.721 |
| 0.010419999999999744 | 10.721 |
| 0.010429999999999743 | 10.721 |
| 0.010439999999999743 | 10.721 |
| 0.010449999999999742 | 10.721 |
| 0.010459999999999742 | 10.721 |
| 0.010469999999999742 | 10.721 |
| 0.010479999999999741 | 10.721 |
| 0.01048999999999974 | 10.721 |
| 0.01049999999999974 | 10.721 |
| 0.01050999999999974 | 10.721 |
| 0.01051999999999974 | 10.721 |
| 0.01052999999999974 | 10.721 |
| 0.010539999999999739 | 10.721 |
| 0.010549999999999738 | 10.721 |
| 0.010559999999999738 | 10.721 |
| 0.010569999999999738 | 10.721 |
| 0.010579999999999737 | 10.721 |
| 0.010589999999999737 | 10.721 |
| 0.010599999999999736 | 10.721 |
| 0.010609999999999736 | 10.721 |
| 0.010619999999999736 | 10.721 |
| 0.010629999999999735 | 10.721 |
| 0.010639999999999735 | 10.721 |
| 0.010649999999999734 | 10.721 |
| 0.010659999999999734 | 10.721 |
| 0.010669999999999734 | 10.721 |
| 0.010679999999999733 | 10.721 |
| 0.010689999999999733 | 10.721 |
| 0.010699999999999732 | 10.721 |
| 0.010709999999999732 | 10.721 |
| 0.010719999999999731 | 10.721 |
| 0.010729999999999731 | 10.721 |
| 0.01073999999999973 | 10.721 |
| 0.01074999999999973 | 10.721 |
| 0.01075999999999973 | 10.721 |
| 0.01076999999999973 | 10.721 |
| 0.010779999999999729 | 10.721 |
| 0.010789999999999729 | 10.721 |
| 0.010799999999999728 | 10.721 |
| 0.010809999999999728 | 10.721 |
| 0.010819999999999727 | 10.721 |
| 0.010829999999999727 | 10.721 |
| 0.010839999999999727 | 10.721 |
| 0.010849999999999726 | 10.721 |
| 0.010859999999999726 | 10.721 |
| 0.010869999999999725 | 10.721 |
| 0.010879999999999725 | 10.721 |
| 0.010889999999999725 | 10.721 |
| 0.010899999999999724 | 10.721 |
| 0.010909999999999724 | 10.721 |
| 0.010919999999999723 | 10.721 |
| 0.010929999999999723 | 10.721 |
| 0.010939999999999723 | 10.721 |
| 0.010949999999999722 | 10.721 |
| 0.010959999999999722 | 10.721 |
| 0.010969999999999721 | 10.721 |
| 0.010979999999999721 | 10.721 |
| 0.01098999999999972 | 10.721 |